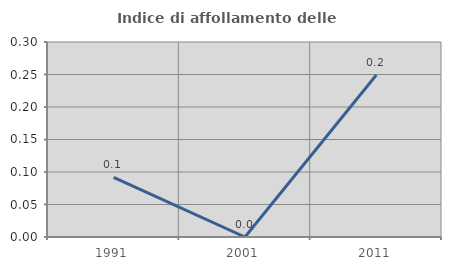
| Category | Indice di affollamento delle abitazioni  |
|---|---|
| 1991.0 | 0.092 |
| 2001.0 | 0 |
| 2011.0 | 0.249 |